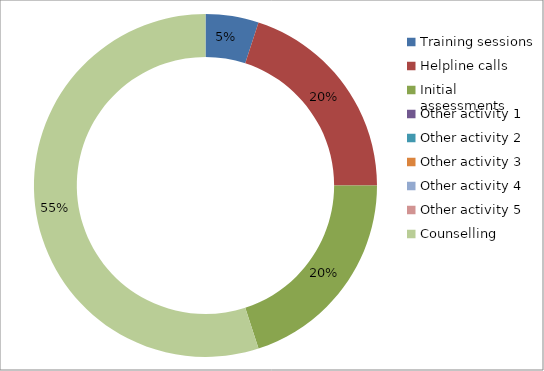
| Category | Series 0 | Series 1 |
|---|---|---|
| Training sessions |  | 0.05 |
| Helpline calls |  | 0.2 |
| Initial assessments |  | 0.2 |
| Other activity 1 |  | 0 |
| Other activity 2 |  | 0 |
| Other activity 3 |  | 0 |
| Other activity 4 |  | 0 |
| Other activity 5 |  | 0 |
| Counselling  |  | 0.55 |